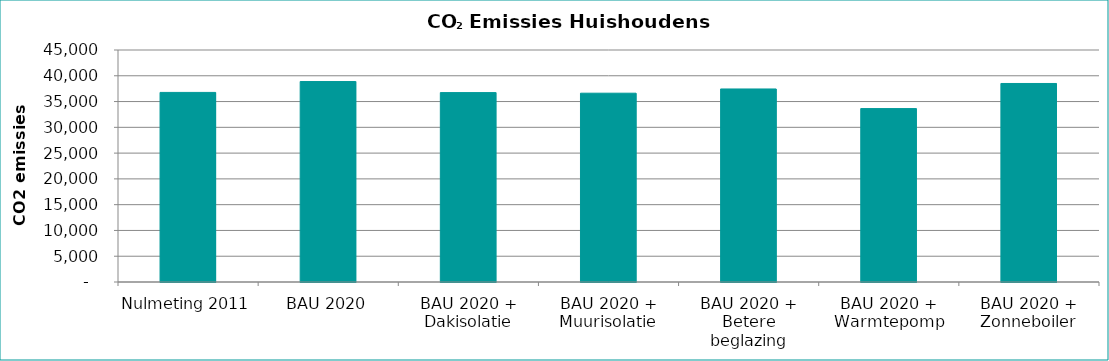
| Category | Series 0 |
|---|---|
| Nulmeting 2011 | 36772.491 |
| BAU 2020 | 38883.493 |
| BAU 2020 + Dakisolatie | 36737.018 |
| BAU 2020 + Muurisolatie | 36620.846 |
| BAU 2020 + Betere beglazing | 37443.18 |
| BAU 2020 + Warmtepomp | 33636.624 |
| BAU 2020 + Zonneboiler | 38507.609 |